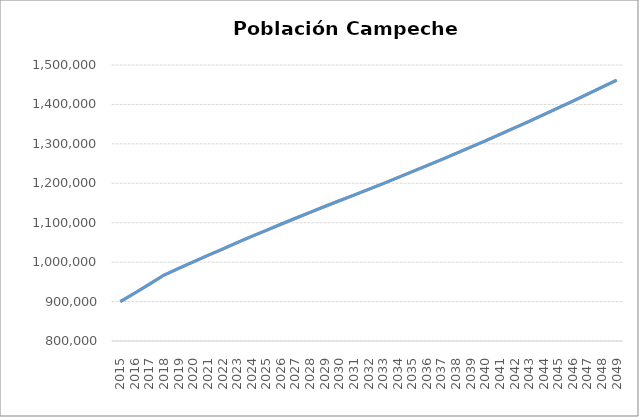
| Category | Población Campeche |
|---|---|
| 2015.0 | 899931 |
| 2016.0 | 921855 |
| 2017.0 | 944314 |
| 2018.0 | 967319 |
| 2019.0 | 984046 |
| 2020.0 | 1000617 |
| 2021.0 | 1017011 |
| 2022.0 | 1033223 |
| 2023.0 | 1049244 |
| 2024.0 | 1065071 |
| 2025.0 | 1080694 |
| 2026.0 | 1096099 |
| 2027.0 | 1111303 |
| 2028.0 | 1126314 |
| 2029.0 | 1141119 |
| 2030.0 | 1155724 |
| 2031.0 | 1170103.084 |
| 2032.0 | 1184661.068 |
| 2033.0 | 1199400.176 |
| 2034.0 | 1214322.663 |
| 2035.0 | 1229430.81 |
| 2036.0 | 1244726.927 |
| 2037.0 | 1260213.352 |
| 2038.0 | 1275892.454 |
| 2039.0 | 1291766.629 |
| 2040.0 | 1307838.305 |
| 2041.0 | 1324109.938 |
| 2042.0 | 1340584.017 |
| 2043.0 | 1357263.061 |
| 2044.0 | 1374149.618 |
| 2045.0 | 1391246.272 |
| 2046.0 | 1408555.636 |
| 2047.0 | 1426080.357 |
| 2048.0 | 1443823.114 |
| 2049.0 | 1461786.619 |